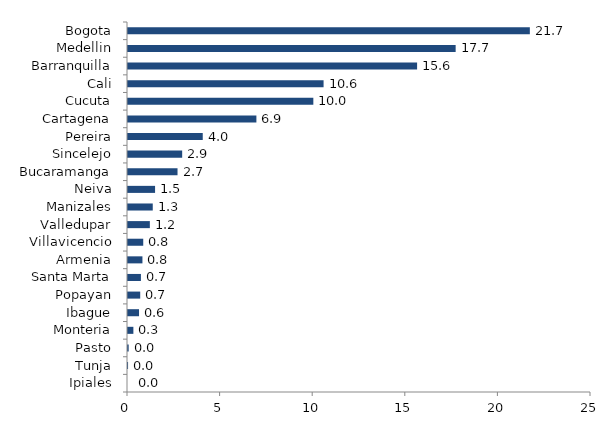
| Category | Series 0 |
|---|---|
| Ipiales | 0 |
| Tunja | 0.003 |
| Pasto | 0.037 |
| Monteria | 0.29 |
| Ibague | 0.596 |
| Popayan | 0.66 |
| Santa Marta | 0.698 |
| Armenia | 0.78 |
| Villavicencio | 0.823 |
| Valledupar | 1.18 |
| Manizales | 1.337 |
| Neiva | 1.462 |
| Bucaramanga | 2.674 |
| Sincelejo | 2.925 |
| Pereira | 4.036 |
| Cartagena | 6.933 |
| Cucuta | 10.008 |
| Cali | 10.56 |
| Barranquilla | 15.61 |
| Medellin | 17.692 |
| Bogota | 21.698 |